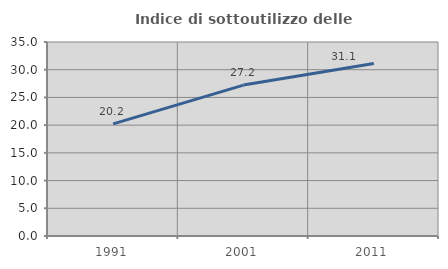
| Category | Indice di sottoutilizzo delle abitazioni  |
|---|---|
| 1991.0 | 20.222 |
| 2001.0 | 27.231 |
| 2011.0 | 31.12 |